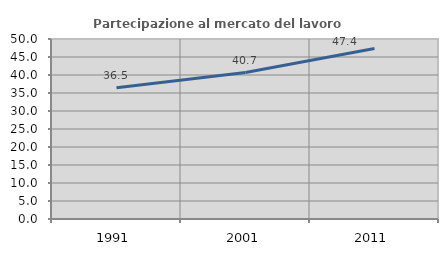
| Category | Partecipazione al mercato del lavoro  femminile |
|---|---|
| 1991.0 | 36.457 |
| 2001.0 | 40.686 |
| 2011.0 | 47.371 |